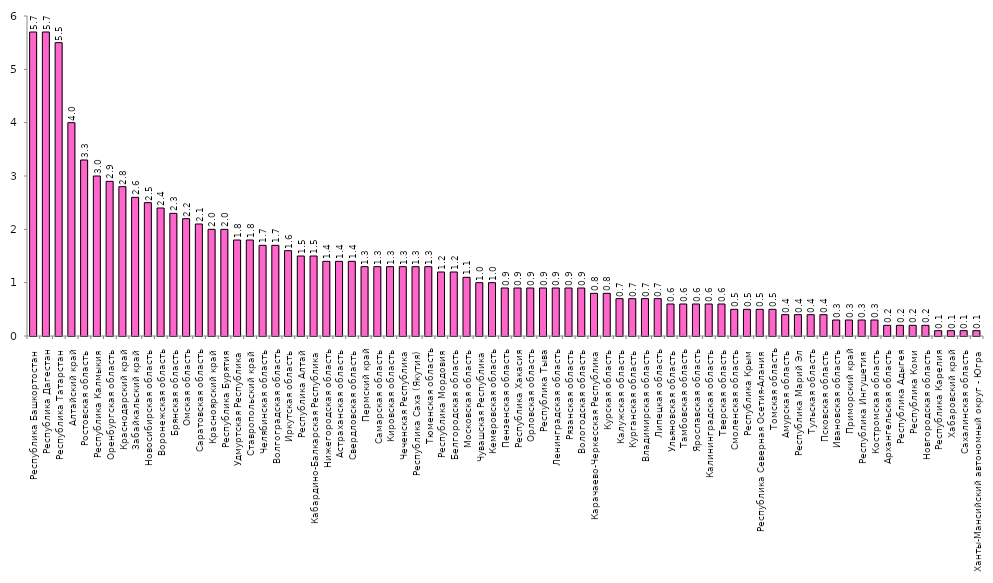
| Category | Series 0 |
|---|---|
| Республика Башкортостан | 5.7 |
| Республика Дагестан | 5.7 |
| Республика Татарстан | 5.5 |
| Алтайский край | 4 |
| Ростовская область | 3.3 |
| Республика Калмыкия | 3 |
| Оренбургская область | 2.9 |
| Краснодарский край | 2.8 |
| Забайкальский край | 2.6 |
| Новосибирская область | 2.5 |
| Воронежская область | 2.4 |
| Брянская область | 2.3 |
| Омская область | 2.2 |
| Саратовская область | 2.1 |
| Красноярский край | 2 |
| Республика Бурятия | 2 |
| Удмуртская Республика | 1.8 |
| Ставропольский край | 1.8 |
| Челябинская область | 1.7 |
| Волгоградская область | 1.7 |
| Иркутская область | 1.6 |
| Республика Алтай | 1.5 |
| Кабардино-Балкарская Республика | 1.5 |
| Нижегородская область | 1.4 |
| Астраханская область | 1.4 |
| Свердловская область | 1.4 |
| Пермский край | 1.3 |
| Самарская область | 1.3 |
| Кировская область | 1.3 |
| Чеченская Республика | 1.3 |
| Республика Саха (Якутия) | 1.3 |
| Тюменская область | 1.3 |
| Республика Мордовия | 1.2 |
| Белгородская область | 1.2 |
| Московская область | 1.1 |
| Чувашская Республика | 1 |
| Кемеровская область | 1 |
| Пензенская область | 0.9 |
| Республика Хакасия | 0.9 |
| Орловская область | 0.9 |
| Республика Тыва | 0.9 |
| Ленинградская область | 0.9 |
| Рязанская область | 0.9 |
| Вологодская область | 0.9 |
| Карачаево-Черкесская Республика | 0.8 |
| Курская область | 0.8 |
| Калужская область | 0.7 |
| Курганская область | 0.7 |
| Владимирская область | 0.7 |
| Липецкая область | 0.7 |
| Ульяновская область | 0.6 |
| Тамбовская область | 0.6 |
| Ярославская область | 0.6 |
| Калининградская область | 0.6 |
| Тверская область | 0.6 |
| Смоленская область | 0.5 |
| Республика Крым | 0.5 |
| Республика Северная Осетия-Алания | 0.5 |
| Томская область | 0.5 |
| Амурская область | 0.4 |
| Республика Марий Эл | 0.4 |
| Тульская область | 0.4 |
| Псковская область | 0.4 |
| Ивановская область | 0.3 |
| Приморский край | 0.3 |
| Республика Ингушетия | 0.3 |
| Костромская область | 0.3 |
| Архангельская область | 0.2 |
| Республика Адыгея | 0.2 |
| Республика Коми | 0.2 |
| Новгородская область | 0.2 |
| Республика Карелия | 0.1 |
| Хабаровский край | 0.1 |
| Сахалинская область | 0.1 |
| Ханты-Мансийский автономный округ - Югра | 0.1 |